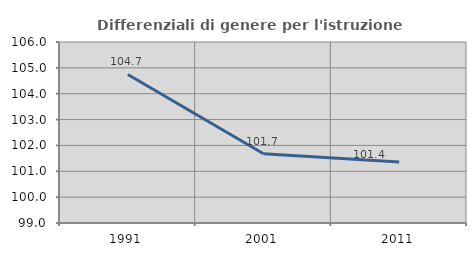
| Category | Differenziali di genere per l'istruzione superiore |
|---|---|
| 1991.0 | 104.745 |
| 2001.0 | 101.676 |
| 2011.0 | 101.363 |